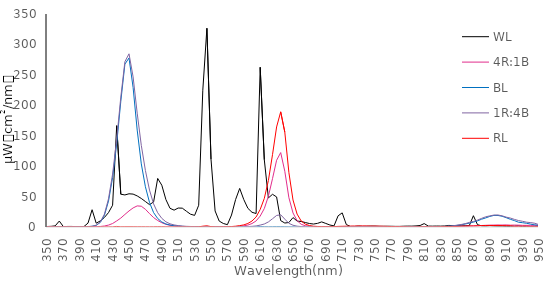
| Category | WL | 4R:1B | BL | 1R:4B | RL |
|---|---|---|---|---|---|
| 350.0 | 0.794 | 0.195 | 0.075 | 0.404 | 0.126 |
| 355.0 | 1.087 | 0.254 | 0.117 | 0.513 | 0.066 |
| 360.0 | 1.867 | 0.177 | 0.088 | 0.111 | 0.022 |
| 365.0 | 9.766 | 0.148 | 0.129 | 0.235 | 0.007 |
| 370.0 | 0.552 | 0.165 | 0.242 | 0.25 | 0.051 |
| 375.0 | 0.881 | 0.081 | 0.15 | 0.456 | 0.093 |
| 380.0 | 0.913 | 0.064 | 0.119 | 0.396 | 0.132 |
| 385.0 | 0.581 | 0.17 | 0.185 | 0.45 | 0.013 |
| 390.0 | 0.479 | 0.132 | 0.166 | 0.487 | 0.003 |
| 395.0 | 0.694 | 0.089 | 0.327 | 0.532 | 0.087 |
| 400.0 | 6.414 | 0.154 | 0.61 | 0.672 | 0.097 |
| 405.0 | 28.382 | 0.24 | 1.146 | 1.173 | 0.161 |
| 410.0 | 6.252 | 0.416 | 2.711 | 2.963 | 0.033 |
| 415.0 | 10.039 | 0.832 | 7.531 | 8.207 | 0.036 |
| 420.0 | 15.628 | 1.639 | 19.169 | 21.039 | 0.086 |
| 425.0 | 23.657 | 3.154 | 42.606 | 46.309 | 0.205 |
| 430.0 | 35.805 | 5.741 | 81.236 | 87.023 | 0.223 |
| 435.0 | 166.477 | 9.976 | 137.015 | 143.977 | 0.906 |
| 440.0 | 53.86 | 14.67 | 206.505 | 213.464 | 0.321 |
| 445.0 | 52.68 | 20.63 | 267.605 | 271.649 | 0.39 |
| 450.0 | 54.566 | 26.378 | 277.725 | 284.569 | 0.41 |
| 455.0 | 54.053 | 31.346 | 229.324 | 246.615 | 0.374 |
| 460.0 | 51.072 | 34.682 | 159.285 | 187.076 | 0.306 |
| 465.0 | 46.866 | 34.126 | 103.733 | 134.133 | 0.347 |
| 470.0 | 41.852 | 29.141 | 66.147 | 92.933 | 0.283 |
| 475.0 | 36.781 | 21.958 | 40.321 | 60.699 | 0.262 |
| 480.0 | 41.138 | 15.487 | 23.649 | 37.943 | 0.287 |
| 485.0 | 79.813 | 10.629 | 13.916 | 23.412 | 0.458 |
| 490.0 | 68.651 | 7.031 | 8.276 | 14.182 | 0.396 |
| 495.0 | 45.087 | 4.394 | 4.975 | 8.525 | 0.301 |
| 500.0 | 30.725 | 2.79 | 3.165 | 5.22 | 0.237 |
| 505.0 | 27.701 | 1.777 | 2.075 | 3.41 | 0.171 |
| 510.0 | 31.157 | 1.196 | 1.433 | 2.285 | 0.188 |
| 515.0 | 30.939 | 0.812 | 1.03 | 1.549 | 0.214 |
| 520.0 | 25.91 | 0.564 | 0.66 | 1.1 | 0.195 |
| 525.0 | 21.06 | 0.421 | 0.511 | 0.827 | 0.15 |
| 530.0 | 19.081 | 0.317 | 0.47 | 0.606 | 0.114 |
| 535.0 | 35.748 | 0.314 | 0.405 | 0.501 | 0.269 |
| 540.0 | 224.767 | 0.706 | 0.748 | 0.67 | 1.334 |
| 545.0 | 326.538 | 0.921 | 0.915 | 0.7 | 1.934 |
| 550.0 | 111.453 | 0.386 | 0.406 | 0.356 | 0.667 |
| 555.0 | 26.364 | 0.201 | 0.205 | 0.241 | 0.228 |
| 560.0 | 9.749 | 0.188 | 0.138 | 0.198 | 0.226 |
| 565.0 | 5.79 | 0.2 | 0.133 | 0.199 | 0.335 |
| 570.0 | 3.836 | 0.298 | 0.124 | 0.182 | 0.432 |
| 575.0 | 19.674 | 0.448 | 0.153 | 0.215 | 0.722 |
| 580.0 | 45.162 | 0.705 | 0.143 | 0.301 | 1.311 |
| 585.0 | 63.375 | 1.148 | 0.154 | 0.381 | 2.238 |
| 590.0 | 44.988 | 1.859 | 0.114 | 0.491 | 3.481 |
| 595.0 | 30.681 | 3.207 | 0.185 | 0.706 | 5.827 |
| 600.0 | 24.185 | 5.697 | 0.18 | 1.064 | 9.817 |
| 605.0 | 22.182 | 9.957 | 0.158 | 1.733 | 16.439 |
| 610.0 | 262.43 | 17.972 | 0.691 | 3.109 | 28.846 |
| 615.0 | 110.53 | 30.309 | 0.364 | 4.953 | 46.917 |
| 620.0 | 47.761 | 50.569 | 0.234 | 8.325 | 76.445 |
| 625.0 | 53.732 | 79.422 | 0.344 | 13.544 | 118.851 |
| 630.0 | 49.415 | 109.664 | 0.416 | 18.964 | 164.408 |
| 635.0 | 10.472 | 122.28 | 0.368 | 20.088 | 189.269 |
| 640.0 | 6.524 | 91.544 | 0.276 | 12.91 | 155.879 |
| 645.0 | 7.374 | 48.121 | 0.153 | 6.011 | 89.369 |
| 650.0 | 15.463 | 23.083 | 0.148 | 2.879 | 44.389 |
| 655.0 | 9.742 | 10.328 | 0.047 | 1.325 | 21.228 |
| 660.0 | 9.048 | 4.465 | 0.028 | 0.708 | 9.885 |
| 665.0 | 7.362 | 2.078 | 0.072 | 0.373 | 4.691 |
| 670.0 | 5.726 | 1.128 | 0.047 | 0.181 | 2.375 |
| 675.0 | 4.868 | 0.687 | 0.063 | 0.145 | 1.281 |
| 680.0 | 6.018 | 0.465 | 0.016 | 0.11 | 0.883 |
| 685.0 | 8.375 | 0.336 | 0.087 | 0.102 | 0.623 |
| 690.0 | 5.832 | 0.316 | 0.152 | 0.027 | 0.567 |
| 695.0 | 3.268 | 0.3 | 0.013 | 0.068 | 0.486 |
| 700.0 | 1.808 | 0.349 | 0.041 | 0.152 | 0.609 |
| 705.0 | 18.387 | 0.572 | 0.062 | 0.207 | 0.979 |
| 710.0 | 23.233 | 0.737 | 0.118 | 0.25 | 1.17 |
| 715.0 | 4.076 | 0.842 | 0.099 | 0.224 | 1.33 |
| 720.0 | 0.852 | 0.859 | 0.029 | 0.176 | 1.471 |
| 725.0 | 0.851 | 0.952 | 0.021 | 0.164 | 1.516 |
| 730.0 | 1.425 | 0.975 | 0.018 | 0.198 | 1.738 |
| 735.0 | 0.858 | 1.04 | 0.015 | 0.336 | 1.768 |
| 740.0 | 1.149 | 0.947 | 0.013 | 0.215 | 1.633 |
| 745.0 | 1.377 | 0.912 | 0.04 | 0.213 | 1.51 |
| 750.0 | 1.374 | 0.919 | 0.074 | 0.269 | 1.447 |
| 755.0 | 1.109 | 0.848 | 0.092 | 0.185 | 1.339 |
| 760.0 | 1.117 | 0.722 | 0 | 0.17 | 1.214 |
| 765.0 | 1.228 | 0.643 | 0.027 | 0.163 | 0.998 |
| 770.0 | 1.188 | 0.521 | 0.08 | 0.265 | 0.73 |
| 775.0 | 1.002 | 0.472 | 0.083 | 0.025 | 0.618 |
| 780.0 | 1.021 | 0.286 | 0.05 | 0.104 | 0.629 |
| 785.0 | 1.286 | 0.265 | 0.042 | 0.165 | 0.418 |
| 790.0 | 1.449 | 0.151 | 0.008 | 0.01 | 0.256 |
| 795.0 | 1.419 | 0.167 | 0.036 | 0.087 | 0.07 |
| 800.0 | 1.775 | 0.194 | 0.035 | 0.077 | 0.192 |
| 805.0 | 2.461 | 0.184 | 0.059 | 0.051 | 0.317 |
| 810.0 | 5.611 | 0.182 | 0.221 | 0.157 | 0.449 |
| 815.0 | 1.492 | 0.299 | 0.082 | 0.161 | 0.341 |
| 820.0 | 1.395 | 0.282 | 0.092 | 0.284 | 0.213 |
| 825.0 | 1.546 | 0.327 | 0.308 | 0.433 | 0.343 |
| 830.0 | 1.454 | 0.499 | 0.656 | 0.731 | 0.427 |
| 835.0 | 1.687 | 0.506 | 0.694 | 1.065 | 0.656 |
| 840.0 | 2.585 | 0.465 | 1.197 | 1.3 | 0.702 |
| 845.0 | 2.239 | 0.732 | 1.696 | 2 | 0.597 |
| 850.0 | 2.064 | 0.84 | 2.639 | 2.959 | 0.903 |
| 855.0 | 1.758 | 1.255 | 3.386 | 4.129 | 1.292 |
| 860.0 | 2.104 | 1.349 | 4.989 | 5.458 | 1.399 |
| 865.0 | 2.205 | 1.548 | 6.329 | 7.523 | 1.687 |
| 870.0 | 18.539 | 1.841 | 8.018 | 9.116 | 1.689 |
| 875.0 | 3.798 | 2.111 | 10.108 | 11.351 | 1.888 |
| 880.0 | 1.914 | 2.444 | 12.811 | 14.182 | 2.408 |
| 885.0 | 1.672 | 2.734 | 14.939 | 16.75 | 2.49 |
| 890.0 | 2.211 | 2.981 | 17.358 | 18.278 | 2.524 |
| 895.0 | 1.729 | 3.166 | 19.038 | 19.61 | 2.428 |
| 900.0 | 1.552 | 3.257 | 18.943 | 19.728 | 2.574 |
| 905.0 | 1.536 | 3.25 | 17.685 | 18.36 | 2.263 |
| 910.0 | 1.222 | 3.435 | 15.324 | 16.207 | 2.141 |
| 915.0 | 1.138 | 3.027 | 12.666 | 14.729 | 2.05 |
| 920.0 | 1.437 | 3.146 | 10.509 | 12.519 | 1.026 |
| 925.0 | 1.847 | 3.025 | 7.849 | 10.626 | 1.064 |
| 930.0 | 0.494 | 2.727 | 7.06 | 9.331 | 1.332 |
| 935.0 | 1.11 | 2.702 | 6.11 | 7.883 | 1.24 |
| 940.0 | 0.742 | 2.635 | 4.662 | 7.182 | 0.599 |
| 945.0 | 0.239 | 2.656 | 3.46 | 6.108 | 0.409 |
| 950.0 | 1.366 | 2.436 | 2.883 | 3.81 | 1.322 |